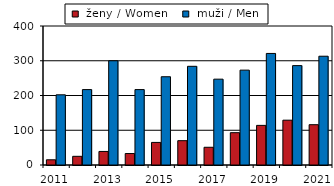
| Category |  ženy / Women  |  muži / Men |
|---|---|---|
| 2011.0 | 15 | 202 |
| 2012.0 | 25 | 217 |
| 2013.0 | 39 | 300 |
| 2014.0 | 33 | 217 |
| 2015.0 | 65 | 254 |
| 2016.0 | 70 | 284 |
| 2017.0 | 51 | 247 |
| 2018.0 | 93 | 273 |
| 2019.0 | 114 | 321 |
| 2020.0 | 129 | 286 |
| 2021.0 | 116 | 313 |